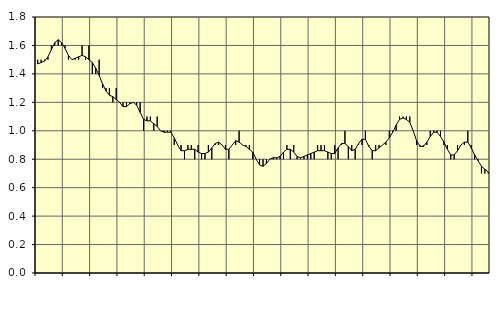
| Category | Piggar | Jordbruk, skogsbruk o fiske, SNI 01-03 |
|---|---|---|
| nan | 1.5 | 1.47 |
| 87.0 | 1.5 | 1.48 |
| 87.0 | 1.5 | 1.49 |
| 87.0 | 1.5 | 1.52 |
| nan | 1.6 | 1.57 |
| 88.0 | 1.6 | 1.62 |
| 88.0 | 1.6 | 1.64 |
| 88.0 | 1.6 | 1.62 |
| nan | 1.6 | 1.58 |
| 89.0 | 1.5 | 1.53 |
| 89.0 | 1.5 | 1.5 |
| 89.0 | 1.5 | 1.51 |
| nan | 1.5 | 1.52 |
| 90.0 | 1.6 | 1.53 |
| 90.0 | 1.5 | 1.52 |
| 90.0 | 1.6 | 1.5 |
| nan | 1.4 | 1.48 |
| 91.0 | 1.4 | 1.44 |
| 91.0 | 1.5 | 1.39 |
| 91.0 | 1.3 | 1.33 |
| nan | 1.3 | 1.28 |
| 92.0 | 1.3 | 1.25 |
| 92.0 | 1.2 | 1.24 |
| 92.0 | 1.3 | 1.22 |
| nan | 1.2 | 1.2 |
| 93.0 | 1.2 | 1.17 |
| 93.0 | 1.2 | 1.17 |
| 93.0 | 1.2 | 1.19 |
| nan | 1.2 | 1.2 |
| 94.0 | 1.2 | 1.18 |
| 94.0 | 1.2 | 1.13 |
| 94.0 | 1 | 1.08 |
| nan | 1.1 | 1.07 |
| 95.0 | 1.1 | 1.07 |
| 95.0 | 1 | 1.05 |
| 95.0 | 1.1 | 1.03 |
| nan | 1 | 1 |
| 96.0 | 1 | 0.99 |
| 96.0 | 1 | 0.99 |
| 96.0 | 1 | 0.99 |
| nan | 0.9 | 0.95 |
| 97.0 | 0.9 | 0.9 |
| 97.0 | 0.9 | 0.86 |
| 97.0 | 0.8 | 0.86 |
| nan | 0.9 | 0.87 |
| 98.0 | 0.9 | 0.87 |
| 98.0 | 0.8 | 0.87 |
| 98.0 | 0.9 | 0.85 |
| nan | 0.8 | 0.84 |
| 99.0 | 0.8 | 0.84 |
| 99.0 | 0.9 | 0.85 |
| 99.0 | 0.8 | 0.88 |
| nan | 0.9 | 0.91 |
| 0.0 | 0.9 | 0.92 |
| 0.0 | 0.9 | 0.9 |
| 0.0 | 0.9 | 0.87 |
| nan | 0.8 | 0.87 |
| 1.0 | 0.9 | 0.9 |
| 1.0 | 0.9 | 0.93 |
| 1.0 | 1 | 0.92 |
| nan | 0.9 | 0.9 |
| 2.0 | 0.9 | 0.89 |
| 2.0 | 0.9 | 0.87 |
| 2.0 | 0.8 | 0.85 |
| nan | 0.8 | 0.8 |
| 3.0 | 0.8 | 0.76 |
| 3.0 | 0.8 | 0.75 |
| 3.0 | 0.8 | 0.77 |
| nan | 0.8 | 0.8 |
| 4.0 | 0.8 | 0.81 |
| 4.0 | 0.8 | 0.81 |
| 4.0 | 0.8 | 0.82 |
| nan | 0.8 | 0.85 |
| 5.0 | 0.9 | 0.87 |
| 5.0 | 0.8 | 0.87 |
| 5.0 | 0.9 | 0.85 |
| nan | 0.8 | 0.82 |
| 6.0 | 0.8 | 0.81 |
| 6.0 | 0.8 | 0.82 |
| 6.0 | 0.8 | 0.83 |
| nan | 0.8 | 0.84 |
| 7.0 | 0.8 | 0.85 |
| 7.0 | 0.9 | 0.86 |
| 7.0 | 0.9 | 0.86 |
| nan | 0.9 | 0.86 |
| 8.0 | 0.8 | 0.85 |
| 8.0 | 0.8 | 0.84 |
| 8.0 | 0.9 | 0.84 |
| nan | 0.8 | 0.88 |
| 9.0 | 0.9 | 0.91 |
| 9.0 | 1 | 0.91 |
| 9.0 | 0.8 | 0.89 |
| nan | 0.9 | 0.86 |
| 10.0 | 0.8 | 0.87 |
| 10.0 | 0.9 | 0.91 |
| 10.0 | 0.9 | 0.94 |
| nan | 1 | 0.94 |
| 11.0 | 0.9 | 0.89 |
| 11.0 | 0.8 | 0.86 |
| 11.0 | 0.9 | 0.86 |
| nan | 0.9 | 0.88 |
| 12.0 | 0.9 | 0.9 |
| 12.0 | 0.9 | 0.92 |
| 12.0 | 1 | 0.95 |
| nan | 1 | 0.99 |
| 13.0 | 1 | 1.04 |
| 13.0 | 1.1 | 1.08 |
| 13.0 | 1.1 | 1.09 |
| nan | 1.1 | 1.08 |
| 14.0 | 1.1 | 1.06 |
| 14.0 | 1 | 1 |
| 14.0 | 0.9 | 0.93 |
| nan | 0.9 | 0.89 |
| 15.0 | 0.9 | 0.89 |
| 15.0 | 0.9 | 0.92 |
| 15.0 | 1 | 0.96 |
| nan | 1 | 0.99 |
| 16.0 | 1 | 0.99 |
| 16.0 | 1 | 0.96 |
| 16.0 | 0.9 | 0.92 |
| nan | 0.9 | 0.87 |
| 17.0 | 0.8 | 0.83 |
| 17.0 | 0.8 | 0.83 |
| 17.0 | 0.9 | 0.86 |
| nan | 0.9 | 0.9 |
| 18.0 | 0.9 | 0.92 |
| 18.0 | 1 | 0.92 |
| 18.0 | 0.9 | 0.88 |
| nan | 0.8 | 0.83 |
| 19.0 | 0.8 | 0.79 |
| 19.0 | 0.7 | 0.75 |
| 19.0 | 0.7 | 0.73 |
| nan | 0.7 | 0.71 |